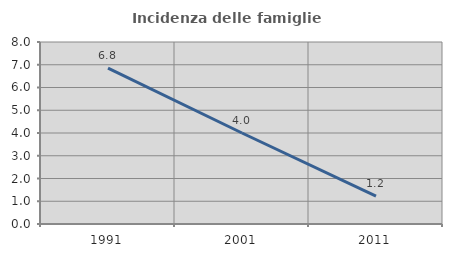
| Category | Incidenza delle famiglie numerose |
|---|---|
| 1991.0 | 6.849 |
| 2001.0 | 4 |
| 2011.0 | 1.227 |